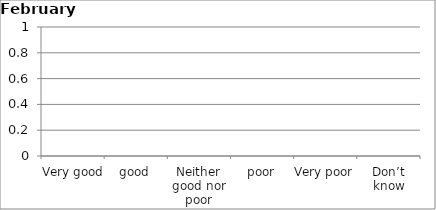
| Category | Series 0 |
|---|---|
| Very good | 0 |
| good | 0 |
| Neither good nor poor | 0 |
| poor | 0 |
| Very poor | 0 |
| Don’t know | 0 |